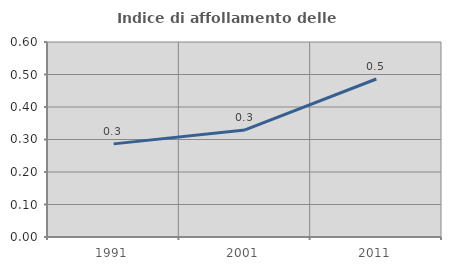
| Category | Indice di affollamento delle abitazioni  |
|---|---|
| 1991.0 | 0.287 |
| 2001.0 | 0.329 |
| 2011.0 | 0.486 |